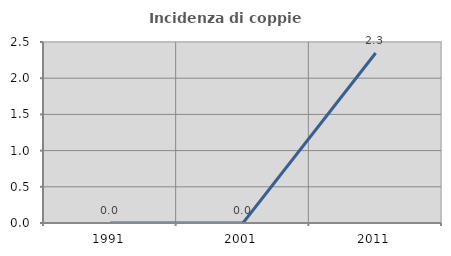
| Category | Incidenza di coppie miste |
|---|---|
| 1991.0 | 0 |
| 2001.0 | 0 |
| 2011.0 | 2.347 |